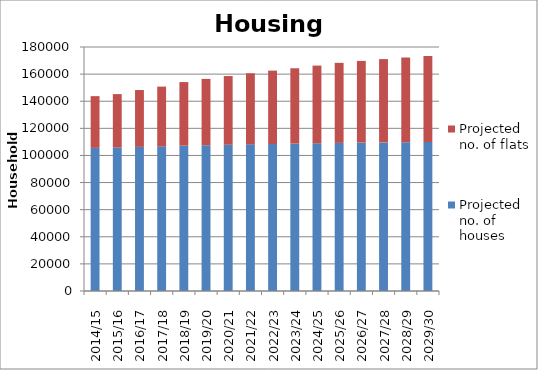
| Category | Projected no. of houses | Projected no. of flats |
|---|---|---|
| 2014/15 | 105578.96 | 38177.04 |
| 2015/16 | 105816.72 | 39425.28 |
| 2016/17 | 106298.8 | 41956.2 |
| 2017/18 | 106702.16 | 44073.84 |
| 2018/19 | 107206.61 | 46932.39 |
| 2019/20 | 107555.81 | 48911.19 |
| 2020/21 | 107870.66 | 50695.34 |
| 2021/22 | 108178.76 | 52441.24 |
| 2022/23 | 108450.92 | 54113.08 |
| 2023/24 | 108695.64 | 55616.36 |
| 2024/25 | 108971.86 | 57313.14 |
| 2025/26 | 109254.8 | 59051.2 |
| 2026/27 | 109442.52 | 60307.48 |
| 2027/28 | 109613.47 | 61451.53 |
| 2028/29 | 109775.45 | 62535.55 |
| 2029/30 | 109910.13 | 63436.87 |